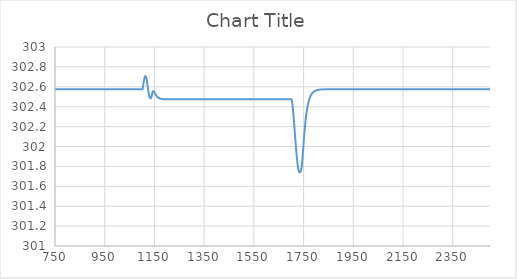
| Category | Series 0 |
|---|---|
| 1.0 | 301.715 |
| 2.0 | 301.755 |
| 3.0 | 301.821 |
| 4.0 | 301.881 |
| 5.0 | 301.937 |
| 6.0 | 301.969 |
| 7.0 | 302.009 |
| 8.0 | 302.044 |
| 9.0 | 302.079 |
| 10.0 | 302.112 |
| 11.0 | 302.143 |
| 12.0 | 302.173 |
| 13.0 | 302.2 |
| 14.0 | 302.227 |
| 15.0 | 302.251 |
| 16.0 | 302.274 |
| 17.0 | 302.296 |
| 18.0 | 302.316 |
| 19.0 | 302.335 |
| 20.0 | 302.352 |
| 21.0 | 302.369 |
| 22.0 | 302.384 |
| 23.0 | 302.398 |
| 24.0 | 302.411 |
| 25.0 | 302.423 |
| 26.0 | 302.434 |
| 27.0 | 302.445 |
| 28.0 | 302.455 |
| 29.0 | 302.464 |
| 30.0 | 302.472 |
| 31.0 | 302.48 |
| 32.0 | 302.487 |
| 33.0 | 302.493 |
| 34.0 | 302.499 |
| 35.0 | 302.505 |
| 36.0 | 302.51 |
| 37.0 | 302.515 |
| 38.0 | 302.52 |
| 39.0 | 302.524 |
| 40.0 | 302.528 |
| 41.0 | 302.531 |
| 42.0 | 302.535 |
| 43.0 | 302.538 |
| 44.0 | 302.54 |
| 45.0 | 302.543 |
| 46.0 | 302.545 |
| 47.0 | 302.548 |
| 48.0 | 302.55 |
| 49.0 | 302.552 |
| 50.0 | 302.553 |
| 51.0 | 302.555 |
| 52.0 | 302.557 |
| 53.0 | 302.558 |
| 54.0 | 302.559 |
| 55.0 | 302.56 |
| 56.0 | 302.562 |
| 57.0 | 302.563 |
| 58.0 | 302.564 |
| 59.0 | 302.564 |
| 60.0 | 302.565 |
| 61.0 | 302.566 |
| 62.0 | 302.567 |
| 63.0 | 302.567 |
| 64.0 | 302.568 |
| 65.0 | 302.568 |
| 66.0 | 302.569 |
| 67.0 | 302.569 |
| 68.0 | 302.57 |
| 69.0 | 302.57 |
| 70.0 | 302.571 |
| 71.0 | 302.571 |
| 72.0 | 302.571 |
| 73.0 | 302.572 |
| 74.0 | 302.572 |
| 75.0 | 302.572 |
| 76.0 | 302.572 |
| 77.0 | 302.573 |
| 78.0 | 302.573 |
| 79.0 | 302.573 |
| 80.0 | 302.573 |
| 81.0 | 302.573 |
| 82.0 | 302.574 |
| 83.0 | 302.574 |
| 84.0 | 302.574 |
| 85.0 | 302.574 |
| 86.0 | 302.574 |
| 87.0 | 302.574 |
| 88.0 | 302.574 |
| 89.0 | 302.574 |
| 90.0 | 302.574 |
| 91.0 | 302.574 |
| 92.0 | 302.575 |
| 93.0 | 302.575 |
| 94.0 | 302.575 |
| 95.0 | 302.575 |
| 96.0 | 302.575 |
| 97.0 | 302.575 |
| 98.0 | 302.575 |
| 99.0 | 302.575 |
| 100.0 | 302.575 |
| 101.0 | 302.575 |
| 102.0 | 302.575 |
| 103.0 | 302.575 |
| 104.0 | 302.575 |
| 105.0 | 302.575 |
| 106.0 | 302.575 |
| 107.0 | 302.575 |
| 108.0 | 302.575 |
| 109.0 | 302.575 |
| 110.0 | 302.575 |
| 111.0 | 302.575 |
| 112.0 | 302.575 |
| 113.0 | 302.575 |
| 114.0 | 302.575 |
| 115.0 | 302.575 |
| 116.0 | 302.575 |
| 117.0 | 302.575 |
| 118.0 | 302.575 |
| 119.0 | 302.575 |
| 120.0 | 302.575 |
| 121.0 | 302.575 |
| 122.0 | 302.575 |
| 123.0 | 302.575 |
| 124.0 | 302.575 |
| 125.0 | 302.575 |
| 126.0 | 302.575 |
| 127.0 | 302.575 |
| 128.0 | 302.575 |
| 129.0 | 302.575 |
| 130.0 | 302.575 |
| 131.0 | 302.575 |
| 132.0 | 302.575 |
| 133.0 | 302.575 |
| 134.0 | 302.575 |
| 135.0 | 302.575 |
| 136.0 | 302.575 |
| 137.0 | 302.575 |
| 138.0 | 302.575 |
| 139.0 | 302.575 |
| 140.0 | 302.575 |
| 141.0 | 302.575 |
| 142.0 | 302.575 |
| 143.0 | 302.575 |
| 144.0 | 302.575 |
| 145.0 | 302.575 |
| 146.0 | 302.575 |
| 147.0 | 302.575 |
| 148.0 | 302.575 |
| 149.0 | 302.575 |
| 150.0 | 302.575 |
| 151.0 | 302.575 |
| 152.0 | 302.575 |
| 153.0 | 302.575 |
| 154.0 | 302.575 |
| 155.0 | 302.575 |
| 156.0 | 302.575 |
| 157.0 | 302.575 |
| 158.0 | 302.575 |
| 159.0 | 302.575 |
| 160.0 | 302.575 |
| 161.0 | 302.575 |
| 162.0 | 302.575 |
| 163.0 | 302.575 |
| 164.0 | 302.575 |
| 165.0 | 302.575 |
| 166.0 | 302.575 |
| 167.0 | 302.575 |
| 168.0 | 302.575 |
| 169.0 | 302.575 |
| 170.0 | 302.575 |
| 171.0 | 302.575 |
| 172.0 | 302.575 |
| 173.0 | 302.575 |
| 174.0 | 302.575 |
| 175.0 | 302.575 |
| 176.0 | 302.575 |
| 177.0 | 302.575 |
| 178.0 | 302.575 |
| 179.0 | 302.575 |
| 180.0 | 302.575 |
| 181.0 | 302.575 |
| 182.0 | 302.575 |
| 183.0 | 302.575 |
| 184.0 | 302.575 |
| 185.0 | 302.575 |
| 186.0 | 302.575 |
| 187.0 | 302.575 |
| 188.0 | 302.575 |
| 189.0 | 302.575 |
| 190.0 | 302.575 |
| 191.0 | 302.575 |
| 192.0 | 302.575 |
| 193.0 | 302.575 |
| 194.0 | 302.575 |
| 195.0 | 302.575 |
| 196.0 | 302.575 |
| 197.0 | 302.575 |
| 198.0 | 302.575 |
| 199.0 | 302.575 |
| 200.0 | 302.575 |
| 201.0 | 302.575 |
| 202.0 | 302.575 |
| 203.0 | 302.575 |
| 204.0 | 302.575 |
| 205.0 | 302.575 |
| 206.0 | 302.575 |
| 207.0 | 302.575 |
| 208.0 | 302.575 |
| 209.0 | 302.575 |
| 210.0 | 302.575 |
| 211.0 | 302.575 |
| 212.0 | 302.575 |
| 213.0 | 302.575 |
| 214.0 | 302.575 |
| 215.0 | 302.575 |
| 216.0 | 302.575 |
| 217.0 | 302.575 |
| 218.0 | 302.575 |
| 219.0 | 302.575 |
| 220.0 | 302.575 |
| 221.0 | 302.575 |
| 222.0 | 302.575 |
| 223.0 | 302.575 |
| 224.0 | 302.575 |
| 225.0 | 302.575 |
| 226.0 | 302.575 |
| 227.0 | 302.575 |
| 228.0 | 302.575 |
| 229.0 | 302.575 |
| 230.0 | 302.575 |
| 231.0 | 302.575 |
| 232.0 | 302.575 |
| 233.0 | 302.575 |
| 234.0 | 302.575 |
| 235.0 | 302.575 |
| 236.0 | 302.575 |
| 237.0 | 302.575 |
| 238.0 | 302.575 |
| 239.0 | 302.575 |
| 240.0 | 302.575 |
| 241.0 | 302.575 |
| 242.0 | 302.575 |
| 243.0 | 302.575 |
| 244.0 | 302.575 |
| 245.0 | 302.575 |
| 246.0 | 302.575 |
| 247.0 | 302.575 |
| 248.0 | 302.575 |
| 249.0 | 302.575 |
| 250.0 | 302.575 |
| 251.0 | 302.575 |
| 252.0 | 302.575 |
| 253.0 | 302.575 |
| 254.0 | 302.575 |
| 255.0 | 302.575 |
| 256.0 | 302.575 |
| 257.0 | 302.575 |
| 258.0 | 302.575 |
| 259.0 | 302.575 |
| 260.0 | 302.575 |
| 261.0 | 302.575 |
| 262.0 | 302.575 |
| 263.0 | 302.575 |
| 264.0 | 302.575 |
| 265.0 | 302.575 |
| 266.0 | 302.575 |
| 267.0 | 302.575 |
| 268.0 | 302.575 |
| 269.0 | 302.575 |
| 270.0 | 302.575 |
| 271.0 | 302.575 |
| 272.0 | 302.575 |
| 273.0 | 302.575 |
| 274.0 | 302.575 |
| 275.0 | 302.575 |
| 276.0 | 302.575 |
| 277.0 | 302.575 |
| 278.0 | 302.575 |
| 279.0 | 302.575 |
| 280.0 | 302.575 |
| 281.0 | 302.575 |
| 282.0 | 302.575 |
| 283.0 | 302.575 |
| 284.0 | 302.575 |
| 285.0 | 302.575 |
| 286.0 | 302.575 |
| 287.0 | 302.575 |
| 288.0 | 302.575 |
| 289.0 | 302.575 |
| 290.0 | 302.575 |
| 291.0 | 302.575 |
| 292.0 | 302.575 |
| 293.0 | 302.575 |
| 294.0 | 302.575 |
| 295.0 | 302.575 |
| 296.0 | 302.575 |
| 297.0 | 302.575 |
| 298.0 | 302.575 |
| 299.0 | 302.575 |
| 300.0 | 302.575 |
| 301.0 | 302.575 |
| 302.0 | 302.575 |
| 303.0 | 302.575 |
| 304.0 | 302.575 |
| 305.0 | 302.575 |
| 306.0 | 302.575 |
| 307.0 | 302.575 |
| 308.0 | 302.575 |
| 309.0 | 302.575 |
| 310.0 | 302.575 |
| 311.0 | 302.575 |
| 312.0 | 302.575 |
| 313.0 | 302.575 |
| 314.0 | 302.575 |
| 315.0 | 302.575 |
| 316.0 | 302.575 |
| 317.0 | 302.575 |
| 318.0 | 302.575 |
| 319.0 | 302.575 |
| 320.0 | 302.575 |
| 321.0 | 302.575 |
| 322.0 | 302.575 |
| 323.0 | 302.575 |
| 324.0 | 302.575 |
| 325.0 | 302.575 |
| 326.0 | 302.575 |
| 327.0 | 302.575 |
| 328.0 | 302.575 |
| 329.0 | 302.575 |
| 330.0 | 302.575 |
| 331.0 | 302.575 |
| 332.0 | 302.575 |
| 333.0 | 302.575 |
| 334.0 | 302.575 |
| 335.0 | 302.575 |
| 336.0 | 302.575 |
| 337.0 | 302.575 |
| 338.0 | 302.575 |
| 339.0 | 302.575 |
| 340.0 | 302.575 |
| 341.0 | 302.575 |
| 342.0 | 302.575 |
| 343.0 | 302.575 |
| 344.0 | 302.575 |
| 345.0 | 302.575 |
| 346.0 | 302.575 |
| 347.0 | 302.575 |
| 348.0 | 302.575 |
| 349.0 | 302.575 |
| 350.0 | 302.575 |
| 351.0 | 302.575 |
| 352.0 | 302.575 |
| 353.0 | 302.575 |
| 354.0 | 302.575 |
| 355.0 | 302.575 |
| 356.0 | 302.575 |
| 357.0 | 302.575 |
| 358.0 | 302.575 |
| 359.0 | 302.575 |
| 360.0 | 302.575 |
| 361.0 | 302.575 |
| 362.0 | 302.575 |
| 363.0 | 302.575 |
| 364.0 | 302.575 |
| 365.0 | 302.575 |
| 366.0 | 302.575 |
| 367.0 | 302.575 |
| 368.0 | 302.575 |
| 369.0 | 302.575 |
| 370.0 | 302.575 |
| 371.0 | 302.575 |
| 372.0 | 302.575 |
| 373.0 | 302.575 |
| 374.0 | 302.575 |
| 375.0 | 302.575 |
| 376.0 | 302.575 |
| 377.0 | 302.575 |
| 378.0 | 302.575 |
| 379.0 | 302.575 |
| 380.0 | 302.575 |
| 381.0 | 302.575 |
| 382.0 | 302.575 |
| 383.0 | 302.575 |
| 384.0 | 302.575 |
| 385.0 | 302.575 |
| 386.0 | 302.575 |
| 387.0 | 302.575 |
| 388.0 | 302.575 |
| 389.0 | 302.575 |
| 390.0 | 302.575 |
| 391.0 | 302.575 |
| 392.0 | 302.575 |
| 393.0 | 302.575 |
| 394.0 | 302.575 |
| 395.0 | 302.575 |
| 396.0 | 302.575 |
| 397.0 | 302.575 |
| 398.0 | 302.575 |
| 399.0 | 302.575 |
| 400.0 | 302.575 |
| 401.0 | 302.575 |
| 402.0 | 302.575 |
| 403.0 | 302.575 |
| 404.0 | 302.575 |
| 405.0 | 302.575 |
| 406.0 | 302.575 |
| 407.0 | 302.575 |
| 408.0 | 302.575 |
| 409.0 | 302.575 |
| 410.0 | 302.575 |
| 411.0 | 302.575 |
| 412.0 | 302.575 |
| 413.0 | 302.575 |
| 414.0 | 302.575 |
| 415.0 | 302.575 |
| 416.0 | 302.575 |
| 417.0 | 302.575 |
| 418.0 | 302.575 |
| 419.0 | 302.575 |
| 420.0 | 302.575 |
| 421.0 | 302.575 |
| 422.0 | 302.575 |
| 423.0 | 302.575 |
| 424.0 | 302.575 |
| 425.0 | 302.575 |
| 426.0 | 302.575 |
| 427.0 | 302.575 |
| 428.0 | 302.575 |
| 429.0 | 302.575 |
| 430.0 | 302.575 |
| 431.0 | 302.575 |
| 432.0 | 302.575 |
| 433.0 | 302.575 |
| 434.0 | 302.575 |
| 435.0 | 302.575 |
| 436.0 | 302.575 |
| 437.0 | 302.575 |
| 438.0 | 302.575 |
| 439.0 | 302.575 |
| 440.0 | 302.575 |
| 441.0 | 302.575 |
| 442.0 | 302.575 |
| 443.0 | 302.575 |
| 444.0 | 302.575 |
| 445.0 | 302.575 |
| 446.0 | 302.575 |
| 447.0 | 302.575 |
| 448.0 | 302.575 |
| 449.0 | 302.575 |
| 450.0 | 302.575 |
| 451.0 | 302.575 |
| 452.0 | 302.575 |
| 453.0 | 302.575 |
| 454.0 | 302.575 |
| 455.0 | 302.575 |
| 456.0 | 302.575 |
| 457.0 | 302.575 |
| 458.0 | 302.575 |
| 459.0 | 302.575 |
| 460.0 | 302.575 |
| 461.0 | 302.575 |
| 462.0 | 302.575 |
| 463.0 | 302.575 |
| 464.0 | 302.575 |
| 465.0 | 302.575 |
| 466.0 | 302.575 |
| 467.0 | 302.575 |
| 468.0 | 302.575 |
| 469.0 | 302.575 |
| 470.0 | 302.575 |
| 471.0 | 302.575 |
| 472.0 | 302.575 |
| 473.0 | 302.575 |
| 474.0 | 302.575 |
| 475.0 | 302.575 |
| 476.0 | 302.575 |
| 477.0 | 302.575 |
| 478.0 | 302.575 |
| 479.0 | 302.575 |
| 480.0 | 302.575 |
| 481.0 | 302.575 |
| 482.0 | 302.575 |
| 483.0 | 302.575 |
| 484.0 | 302.575 |
| 485.0 | 302.575 |
| 486.0 | 302.575 |
| 487.0 | 302.575 |
| 488.0 | 302.575 |
| 489.0 | 302.575 |
| 490.0 | 302.575 |
| 491.0 | 302.575 |
| 492.0 | 302.575 |
| 493.0 | 302.575 |
| 494.0 | 302.575 |
| 495.0 | 302.575 |
| 496.0 | 302.575 |
| 497.0 | 302.575 |
| 498.0 | 302.575 |
| 499.0 | 302.575 |
| 500.0 | 302.575 |
| 501.0 | 302.575 |
| 502.0 | 302.575 |
| 503.0 | 302.575 |
| 504.0 | 302.575 |
| 505.0 | 302.575 |
| 506.0 | 302.575 |
| 507.0 | 302.575 |
| 508.0 | 302.575 |
| 509.0 | 302.575 |
| 510.0 | 302.575 |
| 511.0 | 302.575 |
| 512.0 | 302.575 |
| 513.0 | 302.575 |
| 514.0 | 302.575 |
| 515.0 | 302.575 |
| 516.0 | 302.575 |
| 517.0 | 302.575 |
| 518.0 | 302.575 |
| 519.0 | 302.575 |
| 520.0 | 302.575 |
| 521.0 | 302.575 |
| 522.0 | 302.575 |
| 523.0 | 302.575 |
| 524.0 | 302.575 |
| 525.0 | 302.575 |
| 526.0 | 302.575 |
| 527.0 | 302.575 |
| 528.0 | 302.575 |
| 529.0 | 302.575 |
| 530.0 | 302.575 |
| 531.0 | 302.575 |
| 532.0 | 302.575 |
| 533.0 | 302.575 |
| 534.0 | 302.575 |
| 535.0 | 302.575 |
| 536.0 | 302.575 |
| 537.0 | 302.575 |
| 538.0 | 302.575 |
| 539.0 | 302.575 |
| 540.0 | 302.575 |
| 541.0 | 302.575 |
| 542.0 | 302.575 |
| 543.0 | 302.575 |
| 544.0 | 302.575 |
| 545.0 | 302.575 |
| 546.0 | 302.575 |
| 547.0 | 302.575 |
| 548.0 | 302.575 |
| 549.0 | 302.575 |
| 550.0 | 302.575 |
| 551.0 | 302.575 |
| 552.0 | 302.575 |
| 553.0 | 302.575 |
| 554.0 | 302.575 |
| 555.0 | 302.575 |
| 556.0 | 302.575 |
| 557.0 | 302.575 |
| 558.0 | 302.575 |
| 559.0 | 302.575 |
| 560.0 | 302.575 |
| 561.0 | 302.575 |
| 562.0 | 302.575 |
| 563.0 | 302.575 |
| 564.0 | 302.575 |
| 565.0 | 302.575 |
| 566.0 | 302.575 |
| 567.0 | 302.575 |
| 568.0 | 302.575 |
| 569.0 | 302.575 |
| 570.0 | 302.575 |
| 571.0 | 302.575 |
| 572.0 | 302.575 |
| 573.0 | 302.575 |
| 574.0 | 302.575 |
| 575.0 | 302.575 |
| 576.0 | 302.575 |
| 577.0 | 302.575 |
| 578.0 | 302.575 |
| 579.0 | 302.575 |
| 580.0 | 302.575 |
| 581.0 | 302.575 |
| 582.0 | 302.575 |
| 583.0 | 302.575 |
| 584.0 | 302.575 |
| 585.0 | 302.575 |
| 586.0 | 302.575 |
| 587.0 | 302.575 |
| 588.0 | 302.575 |
| 589.0 | 302.575 |
| 590.0 | 302.575 |
| 591.0 | 302.575 |
| 592.0 | 302.575 |
| 593.0 | 302.575 |
| 594.0 | 302.575 |
| 595.0 | 302.575 |
| 596.0 | 302.575 |
| 597.0 | 302.575 |
| 598.0 | 302.575 |
| 599.0 | 302.575 |
| 600.0 | 302.575 |
| 601.0 | 302.575 |
| 602.0 | 302.575 |
| 603.0 | 302.575 |
| 604.0 | 302.575 |
| 605.0 | 302.575 |
| 606.0 | 302.575 |
| 607.0 | 302.575 |
| 608.0 | 302.575 |
| 609.0 | 302.575 |
| 610.0 | 302.575 |
| 611.0 | 302.575 |
| 612.0 | 302.575 |
| 613.0 | 302.575 |
| 614.0 | 302.575 |
| 615.0 | 302.575 |
| 616.0 | 302.575 |
| 617.0 | 302.575 |
| 618.0 | 302.575 |
| 619.0 | 302.575 |
| 620.0 | 302.575 |
| 621.0 | 302.575 |
| 622.0 | 302.575 |
| 623.0 | 302.575 |
| 624.0 | 302.575 |
| 625.0 | 302.575 |
| 626.0 | 302.575 |
| 627.0 | 302.575 |
| 628.0 | 302.575 |
| 629.0 | 302.575 |
| 630.0 | 302.575 |
| 631.0 | 302.575 |
| 632.0 | 302.575 |
| 633.0 | 302.575 |
| 634.0 | 302.575 |
| 635.0 | 302.575 |
| 636.0 | 302.575 |
| 637.0 | 302.575 |
| 638.0 | 302.575 |
| 639.0 | 302.575 |
| 640.0 | 302.575 |
| 641.0 | 302.575 |
| 642.0 | 302.575 |
| 643.0 | 302.575 |
| 644.0 | 302.575 |
| 645.0 | 302.575 |
| 646.0 | 302.575 |
| 647.0 | 302.575 |
| 648.0 | 302.575 |
| 649.0 | 302.575 |
| 650.0 | 302.575 |
| 651.0 | 302.575 |
| 652.0 | 302.575 |
| 653.0 | 302.575 |
| 654.0 | 302.575 |
| 655.0 | 302.575 |
| 656.0 | 302.575 |
| 657.0 | 302.575 |
| 658.0 | 302.575 |
| 659.0 | 302.575 |
| 660.0 | 302.575 |
| 661.0 | 302.575 |
| 662.0 | 302.575 |
| 663.0 | 302.575 |
| 664.0 | 302.575 |
| 665.0 | 302.575 |
| 666.0 | 302.575 |
| 667.0 | 302.575 |
| 668.0 | 302.575 |
| 669.0 | 302.575 |
| 670.0 | 302.575 |
| 671.0 | 302.575 |
| 672.0 | 302.575 |
| 673.0 | 302.575 |
| 674.0 | 302.575 |
| 675.0 | 302.575 |
| 676.0 | 302.575 |
| 677.0 | 302.575 |
| 678.0 | 302.575 |
| 679.0 | 302.575 |
| 680.0 | 302.575 |
| 681.0 | 302.575 |
| 682.0 | 302.575 |
| 683.0 | 302.575 |
| 684.0 | 302.575 |
| 685.0 | 302.575 |
| 686.0 | 302.575 |
| 687.0 | 302.575 |
| 688.0 | 302.575 |
| 689.0 | 302.575 |
| 690.0 | 302.575 |
| 691.0 | 302.575 |
| 692.0 | 302.575 |
| 693.0 | 302.575 |
| 694.0 | 302.575 |
| 695.0 | 302.575 |
| 696.0 | 302.575 |
| 697.0 | 302.575 |
| 698.0 | 302.575 |
| 699.0 | 302.575 |
| 700.0 | 302.575 |
| 701.0 | 302.575 |
| 702.0 | 302.575 |
| 703.0 | 302.575 |
| 704.0 | 302.575 |
| 705.0 | 302.575 |
| 706.0 | 302.575 |
| 707.0 | 302.575 |
| 708.0 | 302.575 |
| 709.0 | 302.575 |
| 710.0 | 302.575 |
| 711.0 | 302.575 |
| 712.0 | 302.575 |
| 713.0 | 302.575 |
| 714.0 | 302.575 |
| 715.0 | 302.575 |
| 716.0 | 302.575 |
| 717.0 | 302.575 |
| 718.0 | 302.575 |
| 719.0 | 302.575 |
| 720.0 | 302.575 |
| 721.0 | 302.575 |
| 722.0 | 302.575 |
| 723.0 | 302.575 |
| 724.0 | 302.575 |
| 725.0 | 302.575 |
| 726.0 | 302.575 |
| 727.0 | 302.575 |
| 728.0 | 302.575 |
| 729.0 | 302.575 |
| 730.0 | 302.575 |
| 731.0 | 302.575 |
| 732.0 | 302.575 |
| 733.0 | 302.575 |
| 734.0 | 302.575 |
| 735.0 | 302.575 |
| 736.0 | 302.575 |
| 737.0 | 302.575 |
| 738.0 | 302.575 |
| 739.0 | 302.575 |
| 740.0 | 302.575 |
| 741.0 | 302.575 |
| 742.0 | 302.575 |
| 743.0 | 302.575 |
| 744.0 | 302.575 |
| 745.0 | 302.575 |
| 746.0 | 302.575 |
| 747.0 | 302.575 |
| 748.0 | 302.575 |
| 749.0 | 302.575 |
| 750.0 | 302.575 |
| 751.0 | 302.575 |
| 752.0 | 302.575 |
| 753.0 | 302.575 |
| 754.0 | 302.575 |
| 755.0 | 302.575 |
| 756.0 | 302.575 |
| 757.0 | 302.575 |
| 758.0 | 302.575 |
| 759.0 | 302.575 |
| 760.0 | 302.575 |
| 761.0 | 302.575 |
| 762.0 | 302.575 |
| 763.0 | 302.575 |
| 764.0 | 302.575 |
| 765.0 | 302.575 |
| 766.0 | 302.575 |
| 767.0 | 302.575 |
| 768.0 | 302.575 |
| 769.0 | 302.575 |
| 770.0 | 302.575 |
| 771.0 | 302.575 |
| 772.0 | 302.575 |
| 773.0 | 302.575 |
| 774.0 | 302.575 |
| 775.0 | 302.575 |
| 776.0 | 302.575 |
| 777.0 | 302.575 |
| 778.0 | 302.575 |
| 779.0 | 302.575 |
| 780.0 | 302.575 |
| 781.0 | 302.575 |
| 782.0 | 302.575 |
| 783.0 | 302.575 |
| 784.0 | 302.575 |
| 785.0 | 302.575 |
| 786.0 | 302.575 |
| 787.0 | 302.575 |
| 788.0 | 302.575 |
| 789.0 | 302.575 |
| 790.0 | 302.575 |
| 791.0 | 302.575 |
| 792.0 | 302.575 |
| 793.0 | 302.575 |
| 794.0 | 302.575 |
| 795.0 | 302.575 |
| 796.0 | 302.575 |
| 797.0 | 302.575 |
| 798.0 | 302.575 |
| 799.0 | 302.575 |
| 800.0 | 302.575 |
| 801.0 | 302.575 |
| 802.0 | 302.575 |
| 803.0 | 302.575 |
| 804.0 | 302.575 |
| 805.0 | 302.575 |
| 806.0 | 302.575 |
| 807.0 | 302.575 |
| 808.0 | 302.575 |
| 809.0 | 302.575 |
| 810.0 | 302.575 |
| 811.0 | 302.575 |
| 812.0 | 302.575 |
| 813.0 | 302.575 |
| 814.0 | 302.575 |
| 815.0 | 302.575 |
| 816.0 | 302.575 |
| 817.0 | 302.575 |
| 818.0 | 302.575 |
| 819.0 | 302.575 |
| 820.0 | 302.575 |
| 821.0 | 302.575 |
| 822.0 | 302.575 |
| 823.0 | 302.575 |
| 824.0 | 302.575 |
| 825.0 | 302.575 |
| 826.0 | 302.575 |
| 827.0 | 302.575 |
| 828.0 | 302.575 |
| 829.0 | 302.575 |
| 830.0 | 302.575 |
| 831.0 | 302.575 |
| 832.0 | 302.575 |
| 833.0 | 302.575 |
| 834.0 | 302.575 |
| 835.0 | 302.575 |
| 836.0 | 302.575 |
| 837.0 | 302.575 |
| 838.0 | 302.575 |
| 839.0 | 302.575 |
| 840.0 | 302.575 |
| 841.0 | 302.575 |
| 842.0 | 302.575 |
| 843.0 | 302.575 |
| 844.0 | 302.575 |
| 845.0 | 302.575 |
| 846.0 | 302.575 |
| 847.0 | 302.575 |
| 848.0 | 302.575 |
| 849.0 | 302.575 |
| 850.0 | 302.575 |
| 851.0 | 302.575 |
| 852.0 | 302.575 |
| 853.0 | 302.575 |
| 854.0 | 302.575 |
| 855.0 | 302.575 |
| 856.0 | 302.575 |
| 857.0 | 302.575 |
| 858.0 | 302.575 |
| 859.0 | 302.575 |
| 860.0 | 302.575 |
| 861.0 | 302.575 |
| 862.0 | 302.575 |
| 863.0 | 302.575 |
| 864.0 | 302.575 |
| 865.0 | 302.575 |
| 866.0 | 302.575 |
| 867.0 | 302.575 |
| 868.0 | 302.575 |
| 869.0 | 302.575 |
| 870.0 | 302.575 |
| 871.0 | 302.575 |
| 872.0 | 302.575 |
| 873.0 | 302.575 |
| 874.0 | 302.575 |
| 875.0 | 302.575 |
| 876.0 | 302.575 |
| 877.0 | 302.575 |
| 878.0 | 302.575 |
| 879.0 | 302.575 |
| 880.0 | 302.575 |
| 881.0 | 302.575 |
| 882.0 | 302.575 |
| 883.0 | 302.575 |
| 884.0 | 302.575 |
| 885.0 | 302.575 |
| 886.0 | 302.575 |
| 887.0 | 302.575 |
| 888.0 | 302.575 |
| 889.0 | 302.575 |
| 890.0 | 302.575 |
| 891.0 | 302.575 |
| 892.0 | 302.575 |
| 893.0 | 302.575 |
| 894.0 | 302.575 |
| 895.0 | 302.575 |
| 896.0 | 302.575 |
| 897.0 | 302.575 |
| 898.0 | 302.575 |
| 899.0 | 302.575 |
| 900.0 | 302.575 |
| 901.0 | 302.575 |
| 902.0 | 302.575 |
| 903.0 | 302.575 |
| 904.0 | 302.575 |
| 905.0 | 302.575 |
| 906.0 | 302.575 |
| 907.0 | 302.575 |
| 908.0 | 302.575 |
| 909.0 | 302.575 |
| 910.0 | 302.575 |
| 911.0 | 302.575 |
| 912.0 | 302.575 |
| 913.0 | 302.575 |
| 914.0 | 302.575 |
| 915.0 | 302.575 |
| 916.0 | 302.575 |
| 917.0 | 302.575 |
| 918.0 | 302.575 |
| 919.0 | 302.575 |
| 920.0 | 302.575 |
| 921.0 | 302.575 |
| 922.0 | 302.575 |
| 923.0 | 302.575 |
| 924.0 | 302.575 |
| 925.0 | 302.575 |
| 926.0 | 302.575 |
| 927.0 | 302.575 |
| 928.0 | 302.575 |
| 929.0 | 302.575 |
| 930.0 | 302.575 |
| 931.0 | 302.575 |
| 932.0 | 302.575 |
| 933.0 | 302.575 |
| 934.0 | 302.575 |
| 935.0 | 302.575 |
| 936.0 | 302.575 |
| 937.0 | 302.575 |
| 938.0 | 302.575 |
| 939.0 | 302.575 |
| 940.0 | 302.575 |
| 941.0 | 302.575 |
| 942.0 | 302.575 |
| 943.0 | 302.575 |
| 944.0 | 302.575 |
| 945.0 | 302.575 |
| 946.0 | 302.575 |
| 947.0 | 302.575 |
| 948.0 | 302.575 |
| 949.0 | 302.575 |
| 950.0 | 302.575 |
| 951.0 | 302.575 |
| 952.0 | 302.575 |
| 953.0 | 302.575 |
| 954.0 | 302.575 |
| 955.0 | 302.575 |
| 956.0 | 302.575 |
| 957.0 | 302.575 |
| 958.0 | 302.575 |
| 959.0 | 302.575 |
| 960.0 | 302.575 |
| 961.0 | 302.575 |
| 962.0 | 302.575 |
| 963.0 | 302.575 |
| 964.0 | 302.575 |
| 965.0 | 302.575 |
| 966.0 | 302.575 |
| 967.0 | 302.575 |
| 968.0 | 302.575 |
| 969.0 | 302.575 |
| 970.0 | 302.575 |
| 971.0 | 302.575 |
| 972.0 | 302.575 |
| 973.0 | 302.575 |
| 974.0 | 302.575 |
| 975.0 | 302.575 |
| 976.0 | 302.575 |
| 977.0 | 302.575 |
| 978.0 | 302.575 |
| 979.0 | 302.575 |
| 980.0 | 302.575 |
| 981.0 | 302.575 |
| 982.0 | 302.575 |
| 983.0 | 302.575 |
| 984.0 | 302.575 |
| 985.0 | 302.575 |
| 986.0 | 302.575 |
| 987.0 | 302.575 |
| 988.0 | 302.575 |
| 989.0 | 302.575 |
| 990.0 | 302.575 |
| 991.0 | 302.575 |
| 992.0 | 302.575 |
| 993.0 | 302.575 |
| 994.0 | 302.575 |
| 995.0 | 302.575 |
| 996.0 | 302.575 |
| 997.0 | 302.575 |
| 998.0 | 302.575 |
| 999.0 | 302.575 |
| 1000.0 | 302.575 |
| 1001.0 | 302.575 |
| 1002.0 | 302.575 |
| 1003.0 | 302.575 |
| 1004.0 | 302.575 |
| 1005.0 | 302.575 |
| 1006.0 | 302.575 |
| 1007.0 | 302.575 |
| 1008.0 | 302.575 |
| 1009.0 | 302.575 |
| 1010.0 | 302.575 |
| 1011.0 | 302.575 |
| 1012.0 | 302.575 |
| 1013.0 | 302.575 |
| 1014.0 | 302.575 |
| 1015.0 | 302.575 |
| 1016.0 | 302.575 |
| 1017.0 | 302.575 |
| 1018.0 | 302.575 |
| 1019.0 | 302.575 |
| 1020.0 | 302.575 |
| 1021.0 | 302.575 |
| 1022.0 | 302.575 |
| 1023.0 | 302.575 |
| 1024.0 | 302.575 |
| 1025.0 | 302.575 |
| 1026.0 | 302.575 |
| 1027.0 | 302.575 |
| 1028.0 | 302.575 |
| 1029.0 | 302.575 |
| 1030.0 | 302.575 |
| 1031.0 | 302.575 |
| 1032.0 | 302.575 |
| 1033.0 | 302.575 |
| 1034.0 | 302.575 |
| 1035.0 | 302.575 |
| 1036.0 | 302.575 |
| 1037.0 | 302.575 |
| 1038.0 | 302.575 |
| 1039.0 | 302.575 |
| 1040.0 | 302.575 |
| 1041.0 | 302.575 |
| 1042.0 | 302.575 |
| 1043.0 | 302.575 |
| 1044.0 | 302.575 |
| 1045.0 | 302.575 |
| 1046.0 | 302.575 |
| 1047.0 | 302.575 |
| 1048.0 | 302.575 |
| 1049.0 | 302.575 |
| 1050.0 | 302.575 |
| 1051.0 | 302.575 |
| 1052.0 | 302.575 |
| 1053.0 | 302.575 |
| 1054.0 | 302.575 |
| 1055.0 | 302.575 |
| 1056.0 | 302.575 |
| 1057.0 | 302.575 |
| 1058.0 | 302.575 |
| 1059.0 | 302.575 |
| 1060.0 | 302.575 |
| 1061.0 | 302.575 |
| 1062.0 | 302.575 |
| 1063.0 | 302.575 |
| 1064.0 | 302.575 |
| 1065.0 | 302.575 |
| 1066.0 | 302.575 |
| 1067.0 | 302.575 |
| 1068.0 | 302.575 |
| 1069.0 | 302.575 |
| 1070.0 | 302.575 |
| 1071.0 | 302.575 |
| 1072.0 | 302.575 |
| 1073.0 | 302.575 |
| 1074.0 | 302.575 |
| 1075.0 | 302.575 |
| 1076.0 | 302.575 |
| 1077.0 | 302.575 |
| 1078.0 | 302.575 |
| 1079.0 | 302.575 |
| 1080.0 | 302.575 |
| 1081.0 | 302.575 |
| 1082.0 | 302.575 |
| 1083.0 | 302.575 |
| 1084.0 | 302.575 |
| 1085.0 | 302.575 |
| 1086.0 | 302.575 |
| 1087.0 | 302.575 |
| 1088.0 | 302.575 |
| 1089.0 | 302.575 |
| 1090.0 | 302.575 |
| 1091.0 | 302.575 |
| 1092.0 | 302.575 |
| 1093.0 | 302.575 |
| 1094.0 | 302.575 |
| 1095.0 | 302.575 |
| 1096.0 | 302.575 |
| 1097.0 | 302.575 |
| 1098.0 | 302.575 |
| 1099.0 | 302.575 |
| 1100.0 | 302.575 |
| 1101.0 | 302.576 |
| 1102.0 | 302.576 |
| 1103.0 | 302.588 |
| 1104.0 | 302.601 |
| 1105.0 | 302.617 |
| 1106.0 | 302.633 |
| 1107.0 | 302.649 |
| 1108.0 | 302.664 |
| 1109.0 | 302.678 |
| 1110.0 | 302.689 |
| 1111.0 | 302.698 |
| 1112.0 | 302.704 |
| 1113.0 | 302.707 |
| 1114.0 | 302.707 |
| 1115.0 | 302.704 |
| 1116.0 | 302.699 |
| 1117.0 | 302.691 |
| 1118.0 | 302.681 |
| 1119.0 | 302.668 |
| 1120.0 | 302.653 |
| 1121.0 | 302.636 |
| 1122.0 | 302.619 |
| 1123.0 | 302.601 |
| 1124.0 | 302.583 |
| 1125.0 | 302.566 |
| 1126.0 | 302.55 |
| 1127.0 | 302.536 |
| 1128.0 | 302.523 |
| 1129.0 | 302.511 |
| 1130.0 | 302.502 |
| 1131.0 | 302.494 |
| 1132.0 | 302.489 |
| 1133.0 | 302.485 |
| 1134.0 | 302.484 |
| 1135.0 | 302.485 |
| 1136.0 | 302.487 |
| 1137.0 | 302.492 |
| 1138.0 | 302.499 |
| 1139.0 | 302.508 |
| 1140.0 | 302.519 |
| 1141.0 | 302.53 |
| 1142.0 | 302.546 |
| 1143.0 | 302.55 |
| 1144.0 | 302.554 |
| 1145.0 | 302.555 |
| 1146.0 | 302.555 |
| 1147.0 | 302.553 |
| 1148.0 | 302.55 |
| 1149.0 | 302.547 |
| 1150.0 | 302.543 |
| 1151.0 | 302.538 |
| 1152.0 | 302.534 |
| 1153.0 | 302.53 |
| 1154.0 | 302.525 |
| 1155.0 | 302.521 |
| 1156.0 | 302.517 |
| 1157.0 | 302.513 |
| 1158.0 | 302.51 |
| 1159.0 | 302.506 |
| 1160.0 | 302.503 |
| 1161.0 | 302.501 |
| 1162.0 | 302.498 |
| 1163.0 | 302.496 |
| 1164.0 | 302.493 |
| 1165.0 | 302.491 |
| 1166.0 | 302.49 |
| 1167.0 | 302.488 |
| 1168.0 | 302.487 |
| 1169.0 | 302.485 |
| 1170.0 | 302.484 |
| 1171.0 | 302.483 |
| 1172.0 | 302.482 |
| 1173.0 | 302.481 |
| 1174.0 | 302.48 |
| 1175.0 | 302.48 |
| 1176.0 | 302.479 |
| 1177.0 | 302.479 |
| 1178.0 | 302.478 |
| 1179.0 | 302.478 |
| 1180.0 | 302.477 |
| 1181.0 | 302.477 |
| 1182.0 | 302.477 |
| 1183.0 | 302.476 |
| 1184.0 | 302.476 |
| 1185.0 | 302.476 |
| 1186.0 | 302.476 |
| 1187.0 | 302.476 |
| 1188.0 | 302.475 |
| 1189.0 | 302.475 |
| 1190.0 | 302.475 |
| 1191.0 | 302.475 |
| 1192.0 | 302.475 |
| 1193.0 | 302.475 |
| 1194.0 | 302.475 |
| 1195.0 | 302.475 |
| 1196.0 | 302.475 |
| 1197.0 | 302.475 |
| 1198.0 | 302.475 |
| 1199.0 | 302.475 |
| 1200.0 | 302.475 |
| 1201.0 | 302.474 |
| 1202.0 | 302.474 |
| 1203.0 | 302.474 |
| 1204.0 | 302.474 |
| 1205.0 | 302.474 |
| 1206.0 | 302.474 |
| 1207.0 | 302.474 |
| 1208.0 | 302.474 |
| 1209.0 | 302.474 |
| 1210.0 | 302.474 |
| 1211.0 | 302.474 |
| 1212.0 | 302.474 |
| 1213.0 | 302.474 |
| 1214.0 | 302.474 |
| 1215.0 | 302.474 |
| 1216.0 | 302.474 |
| 1217.0 | 302.474 |
| 1218.0 | 302.474 |
| 1219.0 | 302.474 |
| 1220.0 | 302.474 |
| 1221.0 | 302.474 |
| 1222.0 | 302.474 |
| 1223.0 | 302.474 |
| 1224.0 | 302.474 |
| 1225.0 | 302.474 |
| 1226.0 | 302.474 |
| 1227.0 | 302.474 |
| 1228.0 | 302.474 |
| 1229.0 | 302.474 |
| 1230.0 | 302.474 |
| 1231.0 | 302.474 |
| 1232.0 | 302.474 |
| 1233.0 | 302.474 |
| 1234.0 | 302.474 |
| 1235.0 | 302.474 |
| 1236.0 | 302.474 |
| 1237.0 | 302.474 |
| 1238.0 | 302.474 |
| 1239.0 | 302.474 |
| 1240.0 | 302.474 |
| 1241.0 | 302.474 |
| 1242.0 | 302.474 |
| 1243.0 | 302.474 |
| 1244.0 | 302.474 |
| 1245.0 | 302.474 |
| 1246.0 | 302.474 |
| 1247.0 | 302.474 |
| 1248.0 | 302.474 |
| 1249.0 | 302.474 |
| 1250.0 | 302.474 |
| 1251.0 | 302.474 |
| 1252.0 | 302.474 |
| 1253.0 | 302.474 |
| 1254.0 | 302.474 |
| 1255.0 | 302.474 |
| 1256.0 | 302.474 |
| 1257.0 | 302.474 |
| 1258.0 | 302.474 |
| 1259.0 | 302.474 |
| 1260.0 | 302.474 |
| 1261.0 | 302.474 |
| 1262.0 | 302.474 |
| 1263.0 | 302.474 |
| 1264.0 | 302.474 |
| 1265.0 | 302.474 |
| 1266.0 | 302.474 |
| 1267.0 | 302.474 |
| 1268.0 | 302.474 |
| 1269.0 | 302.474 |
| 1270.0 | 302.474 |
| 1271.0 | 302.474 |
| 1272.0 | 302.474 |
| 1273.0 | 302.474 |
| 1274.0 | 302.474 |
| 1275.0 | 302.474 |
| 1276.0 | 302.474 |
| 1277.0 | 302.474 |
| 1278.0 | 302.474 |
| 1279.0 | 302.474 |
| 1280.0 | 302.474 |
| 1281.0 | 302.474 |
| 1282.0 | 302.474 |
| 1283.0 | 302.474 |
| 1284.0 | 302.474 |
| 1285.0 | 302.474 |
| 1286.0 | 302.474 |
| 1287.0 | 302.474 |
| 1288.0 | 302.474 |
| 1289.0 | 302.474 |
| 1290.0 | 302.474 |
| 1291.0 | 302.474 |
| 1292.0 | 302.474 |
| 1293.0 | 302.474 |
| 1294.0 | 302.474 |
| 1295.0 | 302.474 |
| 1296.0 | 302.474 |
| 1297.0 | 302.474 |
| 1298.0 | 302.474 |
| 1299.0 | 302.474 |
| 1300.0 | 302.474 |
| 1301.0 | 302.474 |
| 1302.0 | 302.474 |
| 1303.0 | 302.474 |
| 1304.0 | 302.474 |
| 1305.0 | 302.474 |
| 1306.0 | 302.474 |
| 1307.0 | 302.474 |
| 1308.0 | 302.474 |
| 1309.0 | 302.474 |
| 1310.0 | 302.474 |
| 1311.0 | 302.474 |
| 1312.0 | 302.474 |
| 1313.0 | 302.474 |
| 1314.0 | 302.474 |
| 1315.0 | 302.474 |
| 1316.0 | 302.474 |
| 1317.0 | 302.474 |
| 1318.0 | 302.474 |
| 1319.0 | 302.474 |
| 1320.0 | 302.474 |
| 1321.0 | 302.474 |
| 1322.0 | 302.474 |
| 1323.0 | 302.474 |
| 1324.0 | 302.474 |
| 1325.0 | 302.474 |
| 1326.0 | 302.474 |
| 1327.0 | 302.474 |
| 1328.0 | 302.474 |
| 1329.0 | 302.474 |
| 1330.0 | 302.474 |
| 1331.0 | 302.474 |
| 1332.0 | 302.474 |
| 1333.0 | 302.474 |
| 1334.0 | 302.474 |
| 1335.0 | 302.474 |
| 1336.0 | 302.474 |
| 1337.0 | 302.474 |
| 1338.0 | 302.474 |
| 1339.0 | 302.474 |
| 1340.0 | 302.474 |
| 1341.0 | 302.474 |
| 1342.0 | 302.474 |
| 1343.0 | 302.474 |
| 1344.0 | 302.474 |
| 1345.0 | 302.474 |
| 1346.0 | 302.474 |
| 1347.0 | 302.474 |
| 1348.0 | 302.474 |
| 1349.0 | 302.474 |
| 1350.0 | 302.474 |
| 1351.0 | 302.474 |
| 1352.0 | 302.474 |
| 1353.0 | 302.474 |
| 1354.0 | 302.474 |
| 1355.0 | 302.474 |
| 1356.0 | 302.474 |
| 1357.0 | 302.474 |
| 1358.0 | 302.474 |
| 1359.0 | 302.474 |
| 1360.0 | 302.474 |
| 1361.0 | 302.474 |
| 1362.0 | 302.474 |
| 1363.0 | 302.474 |
| 1364.0 | 302.474 |
| 1365.0 | 302.474 |
| 1366.0 | 302.474 |
| 1367.0 | 302.474 |
| 1368.0 | 302.474 |
| 1369.0 | 302.474 |
| 1370.0 | 302.474 |
| 1371.0 | 302.474 |
| 1372.0 | 302.474 |
| 1373.0 | 302.474 |
| 1374.0 | 302.474 |
| 1375.0 | 302.474 |
| 1376.0 | 302.474 |
| 1377.0 | 302.474 |
| 1378.0 | 302.474 |
| 1379.0 | 302.474 |
| 1380.0 | 302.474 |
| 1381.0 | 302.474 |
| 1382.0 | 302.474 |
| 1383.0 | 302.474 |
| 1384.0 | 302.474 |
| 1385.0 | 302.474 |
| 1386.0 | 302.474 |
| 1387.0 | 302.474 |
| 1388.0 | 302.474 |
| 1389.0 | 302.474 |
| 1390.0 | 302.474 |
| 1391.0 | 302.474 |
| 1392.0 | 302.474 |
| 1393.0 | 302.474 |
| 1394.0 | 302.474 |
| 1395.0 | 302.474 |
| 1396.0 | 302.474 |
| 1397.0 | 302.474 |
| 1398.0 | 302.474 |
| 1399.0 | 302.474 |
| 1400.0 | 302.474 |
| 1401.0 | 302.474 |
| 1402.0 | 302.474 |
| 1403.0 | 302.474 |
| 1404.0 | 302.474 |
| 1405.0 | 302.474 |
| 1406.0 | 302.474 |
| 1407.0 | 302.474 |
| 1408.0 | 302.474 |
| 1409.0 | 302.474 |
| 1410.0 | 302.474 |
| 1411.0 | 302.474 |
| 1412.0 | 302.474 |
| 1413.0 | 302.474 |
| 1414.0 | 302.474 |
| 1415.0 | 302.474 |
| 1416.0 | 302.474 |
| 1417.0 | 302.474 |
| 1418.0 | 302.474 |
| 1419.0 | 302.474 |
| 1420.0 | 302.474 |
| 1421.0 | 302.474 |
| 1422.0 | 302.474 |
| 1423.0 | 302.474 |
| 1424.0 | 302.474 |
| 1425.0 | 302.474 |
| 1426.0 | 302.474 |
| 1427.0 | 302.474 |
| 1428.0 | 302.474 |
| 1429.0 | 302.474 |
| 1430.0 | 302.474 |
| 1431.0 | 302.474 |
| 1432.0 | 302.474 |
| 1433.0 | 302.474 |
| 1434.0 | 302.474 |
| 1435.0 | 302.474 |
| 1436.0 | 302.474 |
| 1437.0 | 302.474 |
| 1438.0 | 302.474 |
| 1439.0 | 302.474 |
| 1440.0 | 302.474 |
| 1441.0 | 302.474 |
| 1442.0 | 302.474 |
| 1443.0 | 302.474 |
| 1444.0 | 302.474 |
| 1445.0 | 302.474 |
| 1446.0 | 302.474 |
| 1447.0 | 302.474 |
| 1448.0 | 302.474 |
| 1449.0 | 302.474 |
| 1450.0 | 302.474 |
| 1451.0 | 302.474 |
| 1452.0 | 302.474 |
| 1453.0 | 302.474 |
| 1454.0 | 302.474 |
| 1455.0 | 302.474 |
| 1456.0 | 302.474 |
| 1457.0 | 302.474 |
| 1458.0 | 302.474 |
| 1459.0 | 302.474 |
| 1460.0 | 302.474 |
| 1461.0 | 302.474 |
| 1462.0 | 302.474 |
| 1463.0 | 302.474 |
| 1464.0 | 302.474 |
| 1465.0 | 302.474 |
| 1466.0 | 302.474 |
| 1467.0 | 302.474 |
| 1468.0 | 302.474 |
| 1469.0 | 302.474 |
| 1470.0 | 302.474 |
| 1471.0 | 302.474 |
| 1472.0 | 302.474 |
| 1473.0 | 302.474 |
| 1474.0 | 302.474 |
| 1475.0 | 302.474 |
| 1476.0 | 302.474 |
| 1477.0 | 302.474 |
| 1478.0 | 302.474 |
| 1479.0 | 302.474 |
| 1480.0 | 302.474 |
| 1481.0 | 302.474 |
| 1482.0 | 302.474 |
| 1483.0 | 302.474 |
| 1484.0 | 302.474 |
| 1485.0 | 302.474 |
| 1486.0 | 302.474 |
| 1487.0 | 302.474 |
| 1488.0 | 302.474 |
| 1489.0 | 302.474 |
| 1490.0 | 302.474 |
| 1491.0 | 302.474 |
| 1492.0 | 302.474 |
| 1493.0 | 302.474 |
| 1494.0 | 302.474 |
| 1495.0 | 302.474 |
| 1496.0 | 302.474 |
| 1497.0 | 302.474 |
| 1498.0 | 302.474 |
| 1499.0 | 302.474 |
| 1500.0 | 302.474 |
| 1501.0 | 302.474 |
| 1502.0 | 302.474 |
| 1503.0 | 302.474 |
| 1504.0 | 302.474 |
| 1505.0 | 302.474 |
| 1506.0 | 302.474 |
| 1507.0 | 302.474 |
| 1508.0 | 302.474 |
| 1509.0 | 302.474 |
| 1510.0 | 302.474 |
| 1511.0 | 302.474 |
| 1512.0 | 302.474 |
| 1513.0 | 302.474 |
| 1514.0 | 302.474 |
| 1515.0 | 302.474 |
| 1516.0 | 302.474 |
| 1517.0 | 302.474 |
| 1518.0 | 302.474 |
| 1519.0 | 302.474 |
| 1520.0 | 302.474 |
| 1521.0 | 302.474 |
| 1522.0 | 302.474 |
| 1523.0 | 302.474 |
| 1524.0 | 302.474 |
| 1525.0 | 302.474 |
| 1526.0 | 302.474 |
| 1527.0 | 302.474 |
| 1528.0 | 302.474 |
| 1529.0 | 302.474 |
| 1530.0 | 302.474 |
| 1531.0 | 302.474 |
| 1532.0 | 302.474 |
| 1533.0 | 302.474 |
| 1534.0 | 302.474 |
| 1535.0 | 302.474 |
| 1536.0 | 302.474 |
| 1537.0 | 302.474 |
| 1538.0 | 302.474 |
| 1539.0 | 302.474 |
| 1540.0 | 302.474 |
| 1541.0 | 302.474 |
| 1542.0 | 302.474 |
| 1543.0 | 302.474 |
| 1544.0 | 302.474 |
| 1545.0 | 302.474 |
| 1546.0 | 302.474 |
| 1547.0 | 302.474 |
| 1548.0 | 302.474 |
| 1549.0 | 302.474 |
| 1550.0 | 302.474 |
| 1551.0 | 302.474 |
| 1552.0 | 302.474 |
| 1553.0 | 302.474 |
| 1554.0 | 302.474 |
| 1555.0 | 302.474 |
| 1556.0 | 302.474 |
| 1557.0 | 302.474 |
| 1558.0 | 302.474 |
| 1559.0 | 302.474 |
| 1560.0 | 302.474 |
| 1561.0 | 302.474 |
| 1562.0 | 302.474 |
| 1563.0 | 302.474 |
| 1564.0 | 302.474 |
| 1565.0 | 302.474 |
| 1566.0 | 302.474 |
| 1567.0 | 302.474 |
| 1568.0 | 302.474 |
| 1569.0 | 302.474 |
| 1570.0 | 302.474 |
| 1571.0 | 302.474 |
| 1572.0 | 302.474 |
| 1573.0 | 302.474 |
| 1574.0 | 302.474 |
| 1575.0 | 302.474 |
| 1576.0 | 302.474 |
| 1577.0 | 302.474 |
| 1578.0 | 302.474 |
| 1579.0 | 302.474 |
| 1580.0 | 302.474 |
| 1581.0 | 302.474 |
| 1582.0 | 302.474 |
| 1583.0 | 302.474 |
| 1584.0 | 302.474 |
| 1585.0 | 302.474 |
| 1586.0 | 302.474 |
| 1587.0 | 302.474 |
| 1588.0 | 302.474 |
| 1589.0 | 302.474 |
| 1590.0 | 302.474 |
| 1591.0 | 302.474 |
| 1592.0 | 302.474 |
| 1593.0 | 302.474 |
| 1594.0 | 302.474 |
| 1595.0 | 302.474 |
| 1596.0 | 302.474 |
| 1597.0 | 302.474 |
| 1598.0 | 302.474 |
| 1599.0 | 302.474 |
| 1600.0 | 302.474 |
| 1601.0 | 302.474 |
| 1602.0 | 302.474 |
| 1603.0 | 302.474 |
| 1604.0 | 302.474 |
| 1605.0 | 302.474 |
| 1606.0 | 302.474 |
| 1607.0 | 302.474 |
| 1608.0 | 302.474 |
| 1609.0 | 302.474 |
| 1610.0 | 302.474 |
| 1611.0 | 302.474 |
| 1612.0 | 302.474 |
| 1613.0 | 302.474 |
| 1614.0 | 302.474 |
| 1615.0 | 302.474 |
| 1616.0 | 302.474 |
| 1617.0 | 302.474 |
| 1618.0 | 302.474 |
| 1619.0 | 302.474 |
| 1620.0 | 302.474 |
| 1621.0 | 302.474 |
| 1622.0 | 302.474 |
| 1623.0 | 302.474 |
| 1624.0 | 302.474 |
| 1625.0 | 302.474 |
| 1626.0 | 302.474 |
| 1627.0 | 302.474 |
| 1628.0 | 302.474 |
| 1629.0 | 302.474 |
| 1630.0 | 302.474 |
| 1631.0 | 302.474 |
| 1632.0 | 302.474 |
| 1633.0 | 302.474 |
| 1634.0 | 302.474 |
| 1635.0 | 302.474 |
| 1636.0 | 302.474 |
| 1637.0 | 302.474 |
| 1638.0 | 302.474 |
| 1639.0 | 302.474 |
| 1640.0 | 302.474 |
| 1641.0 | 302.474 |
| 1642.0 | 302.474 |
| 1643.0 | 302.474 |
| 1644.0 | 302.474 |
| 1645.0 | 302.474 |
| 1646.0 | 302.474 |
| 1647.0 | 302.474 |
| 1648.0 | 302.474 |
| 1649.0 | 302.474 |
| 1650.0 | 302.474 |
| 1651.0 | 302.474 |
| 1652.0 | 302.474 |
| 1653.0 | 302.474 |
| 1654.0 | 302.474 |
| 1655.0 | 302.474 |
| 1656.0 | 302.474 |
| 1657.0 | 302.474 |
| 1658.0 | 302.474 |
| 1659.0 | 302.474 |
| 1660.0 | 302.474 |
| 1661.0 | 302.474 |
| 1662.0 | 302.474 |
| 1663.0 | 302.474 |
| 1664.0 | 302.474 |
| 1665.0 | 302.474 |
| 1666.0 | 302.474 |
| 1667.0 | 302.474 |
| 1668.0 | 302.474 |
| 1669.0 | 302.474 |
| 1670.0 | 302.474 |
| 1671.0 | 302.474 |
| 1672.0 | 302.474 |
| 1673.0 | 302.474 |
| 1674.0 | 302.474 |
| 1675.0 | 302.474 |
| 1676.0 | 302.474 |
| 1677.0 | 302.474 |
| 1678.0 | 302.474 |
| 1679.0 | 302.474 |
| 1680.0 | 302.474 |
| 1681.0 | 302.474 |
| 1682.0 | 302.474 |
| 1683.0 | 302.474 |
| 1684.0 | 302.474 |
| 1685.0 | 302.474 |
| 1686.0 | 302.474 |
| 1687.0 | 302.474 |
| 1688.0 | 302.474 |
| 1689.0 | 302.474 |
| 1690.0 | 302.474 |
| 1691.0 | 302.474 |
| 1692.0 | 302.474 |
| 1693.0 | 302.474 |
| 1694.0 | 302.474 |
| 1695.0 | 302.474 |
| 1696.0 | 302.474 |
| 1697.0 | 302.474 |
| 1698.0 | 302.474 |
| 1699.0 | 302.474 |
| 1700.0 | 302.474 |
| 1701.0 | 302.473 |
| 1702.0 | 302.474 |
| 1703.0 | 302.461 |
| 1704.0 | 302.448 |
| 1705.0 | 302.429 |
| 1706.0 | 302.407 |
| 1707.0 | 302.382 |
| 1708.0 | 302.355 |
| 1709.0 | 302.326 |
| 1710.0 | 302.296 |
| 1711.0 | 302.264 |
| 1712.0 | 302.232 |
| 1713.0 | 302.199 |
| 1714.0 | 302.166 |
| 1715.0 | 302.133 |
| 1716.0 | 302.1 |
| 1717.0 | 302.067 |
| 1718.0 | 302.035 |
| 1719.0 | 302.003 |
| 1720.0 | 301.973 |
| 1721.0 | 301.944 |
| 1722.0 | 301.915 |
| 1723.0 | 301.889 |
| 1724.0 | 301.863 |
| 1725.0 | 301.84 |
| 1726.0 | 301.819 |
| 1727.0 | 301.8 |
| 1728.0 | 301.784 |
| 1729.0 | 301.771 |
| 1730.0 | 301.76 |
| 1731.0 | 301.752 |
| 1732.0 | 301.746 |
| 1733.0 | 301.742 |
| 1734.0 | 301.741 |
| 1735.0 | 301.741 |
| 1736.0 | 301.742 |
| 1737.0 | 301.746 |
| 1738.0 | 301.751 |
| 1739.0 | 301.757 |
| 1740.0 | 301.765 |
| 1741.0 | 301.775 |
| 1742.0 | 301.784 |
| 1743.0 | 301.808 |
| 1744.0 | 301.833 |
| 1745.0 | 301.863 |
| 1746.0 | 301.895 |
| 1747.0 | 301.928 |
| 1748.0 | 301.962 |
| 1749.0 | 301.996 |
| 1750.0 | 302.03 |
| 1751.0 | 302.063 |
| 1752.0 | 302.095 |
| 1753.0 | 302.126 |
| 1754.0 | 302.156 |
| 1755.0 | 302.184 |
| 1756.0 | 302.211 |
| 1757.0 | 302.236 |
| 1758.0 | 302.26 |
| 1759.0 | 302.282 |
| 1760.0 | 302.303 |
| 1761.0 | 302.323 |
| 1762.0 | 302.341 |
| 1763.0 | 302.358 |
| 1764.0 | 302.374 |
| 1765.0 | 302.388 |
| 1766.0 | 302.402 |
| 1767.0 | 302.415 |
| 1768.0 | 302.427 |
| 1769.0 | 302.438 |
| 1770.0 | 302.448 |
| 1771.0 | 302.457 |
| 1772.0 | 302.466 |
| 1773.0 | 302.474 |
| 1774.0 | 302.482 |
| 1775.0 | 302.489 |
| 1776.0 | 302.495 |
| 1777.0 | 302.501 |
| 1778.0 | 302.507 |
| 1779.0 | 302.512 |
| 1780.0 | 302.517 |
| 1781.0 | 302.521 |
| 1782.0 | 302.525 |
| 1783.0 | 302.529 |
| 1784.0 | 302.532 |
| 1785.0 | 302.535 |
| 1786.0 | 302.538 |
| 1787.0 | 302.541 |
| 1788.0 | 302.544 |
| 1789.0 | 302.546 |
| 1790.0 | 302.548 |
| 1791.0 | 302.55 |
| 1792.0 | 302.552 |
| 1793.0 | 302.554 |
| 1794.0 | 302.556 |
| 1795.0 | 302.557 |
| 1796.0 | 302.558 |
| 1797.0 | 302.56 |
| 1798.0 | 302.561 |
| 1799.0 | 302.562 |
| 1800.0 | 302.563 |
| 1801.0 | 302.564 |
| 1802.0 | 302.565 |
| 1803.0 | 302.565 |
| 1804.0 | 302.566 |
| 1805.0 | 302.567 |
| 1806.0 | 302.568 |
| 1807.0 | 302.568 |
| 1808.0 | 302.569 |
| 1809.0 | 302.569 |
| 1810.0 | 302.57 |
| 1811.0 | 302.57 |
| 1812.0 | 302.57 |
| 1813.0 | 302.571 |
| 1814.0 | 302.571 |
| 1815.0 | 302.571 |
| 1816.0 | 302.572 |
| 1817.0 | 302.572 |
| 1818.0 | 302.572 |
| 1819.0 | 302.572 |
| 1820.0 | 302.573 |
| 1821.0 | 302.573 |
| 1822.0 | 302.573 |
| 1823.0 | 302.573 |
| 1824.0 | 302.573 |
| 1825.0 | 302.574 |
| 1826.0 | 302.574 |
| 1827.0 | 302.574 |
| 1828.0 | 302.574 |
| 1829.0 | 302.574 |
| 1830.0 | 302.574 |
| 1831.0 | 302.574 |
| 1832.0 | 302.574 |
| 1833.0 | 302.574 |
| 1834.0 | 302.574 |
| 1835.0 | 302.575 |
| 1836.0 | 302.575 |
| 1837.0 | 302.575 |
| 1838.0 | 302.575 |
| 1839.0 | 302.575 |
| 1840.0 | 302.575 |
| 1841.0 | 302.575 |
| 1842.0 | 302.575 |
| 1843.0 | 302.575 |
| 1844.0 | 302.575 |
| 1845.0 | 302.575 |
| 1846.0 | 302.575 |
| 1847.0 | 302.575 |
| 1848.0 | 302.575 |
| 1849.0 | 302.575 |
| 1850.0 | 302.575 |
| 1851.0 | 302.575 |
| 1852.0 | 302.575 |
| 1853.0 | 302.575 |
| 1854.0 | 302.575 |
| 1855.0 | 302.575 |
| 1856.0 | 302.575 |
| 1857.0 | 302.575 |
| 1858.0 | 302.575 |
| 1859.0 | 302.575 |
| 1860.0 | 302.575 |
| 1861.0 | 302.575 |
| 1862.0 | 302.575 |
| 1863.0 | 302.575 |
| 1864.0 | 302.575 |
| 1865.0 | 302.575 |
| 1866.0 | 302.575 |
| 1867.0 | 302.575 |
| 1868.0 | 302.575 |
| 1869.0 | 302.575 |
| 1870.0 | 302.575 |
| 1871.0 | 302.575 |
| 1872.0 | 302.575 |
| 1873.0 | 302.575 |
| 1874.0 | 302.575 |
| 1875.0 | 302.575 |
| 1876.0 | 302.575 |
| 1877.0 | 302.575 |
| 1878.0 | 302.575 |
| 1879.0 | 302.575 |
| 1880.0 | 302.575 |
| 1881.0 | 302.575 |
| 1882.0 | 302.575 |
| 1883.0 | 302.575 |
| 1884.0 | 302.575 |
| 1885.0 | 302.575 |
| 1886.0 | 302.575 |
| 1887.0 | 302.575 |
| 1888.0 | 302.575 |
| 1889.0 | 302.575 |
| 1890.0 | 302.575 |
| 1891.0 | 302.575 |
| 1892.0 | 302.575 |
| 1893.0 | 302.575 |
| 1894.0 | 302.575 |
| 1895.0 | 302.575 |
| 1896.0 | 302.575 |
| 1897.0 | 302.575 |
| 1898.0 | 302.575 |
| 1899.0 | 302.575 |
| 1900.0 | 302.575 |
| 1901.0 | 302.575 |
| 1902.0 | 302.575 |
| 1903.0 | 302.575 |
| 1904.0 | 302.575 |
| 1905.0 | 302.575 |
| 1906.0 | 302.575 |
| 1907.0 | 302.575 |
| 1908.0 | 302.575 |
| 1909.0 | 302.575 |
| 1910.0 | 302.575 |
| 1911.0 | 302.575 |
| 1912.0 | 302.575 |
| 1913.0 | 302.575 |
| 1914.0 | 302.575 |
| 1915.0 | 302.575 |
| 1916.0 | 302.575 |
| 1917.0 | 302.575 |
| 1918.0 | 302.575 |
| 1919.0 | 302.575 |
| 1920.0 | 302.575 |
| 1921.0 | 302.575 |
| 1922.0 | 302.575 |
| 1923.0 | 302.575 |
| 1924.0 | 302.575 |
| 1925.0 | 302.575 |
| 1926.0 | 302.575 |
| 1927.0 | 302.575 |
| 1928.0 | 302.575 |
| 1929.0 | 302.575 |
| 1930.0 | 302.575 |
| 1931.0 | 302.575 |
| 1932.0 | 302.575 |
| 1933.0 | 302.575 |
| 1934.0 | 302.575 |
| 1935.0 | 302.575 |
| 1936.0 | 302.575 |
| 1937.0 | 302.575 |
| 1938.0 | 302.575 |
| 1939.0 | 302.575 |
| 1940.0 | 302.575 |
| 1941.0 | 302.575 |
| 1942.0 | 302.575 |
| 1943.0 | 302.575 |
| 1944.0 | 302.575 |
| 1945.0 | 302.575 |
| 1946.0 | 302.575 |
| 1947.0 | 302.575 |
| 1948.0 | 302.575 |
| 1949.0 | 302.575 |
| 1950.0 | 302.575 |
| 1951.0 | 302.575 |
| 1952.0 | 302.575 |
| 1953.0 | 302.575 |
| 1954.0 | 302.575 |
| 1955.0 | 302.575 |
| 1956.0 | 302.575 |
| 1957.0 | 302.575 |
| 1958.0 | 302.575 |
| 1959.0 | 302.575 |
| 1960.0 | 302.575 |
| 1961.0 | 302.575 |
| 1962.0 | 302.575 |
| 1963.0 | 302.575 |
| 1964.0 | 302.575 |
| 1965.0 | 302.575 |
| 1966.0 | 302.575 |
| 1967.0 | 302.575 |
| 1968.0 | 302.575 |
| 1969.0 | 302.575 |
| 1970.0 | 302.575 |
| 1971.0 | 302.575 |
| 1972.0 | 302.575 |
| 1973.0 | 302.575 |
| 1974.0 | 302.575 |
| 1975.0 | 302.575 |
| 1976.0 | 302.575 |
| 1977.0 | 302.575 |
| 1978.0 | 302.575 |
| 1979.0 | 302.575 |
| 1980.0 | 302.575 |
| 1981.0 | 302.575 |
| 1982.0 | 302.575 |
| 1983.0 | 302.575 |
| 1984.0 | 302.575 |
| 1985.0 | 302.575 |
| 1986.0 | 302.575 |
| 1987.0 | 302.575 |
| 1988.0 | 302.575 |
| 1989.0 | 302.575 |
| 1990.0 | 302.575 |
| 1991.0 | 302.575 |
| 1992.0 | 302.575 |
| 1993.0 | 302.575 |
| 1994.0 | 302.575 |
| 1995.0 | 302.575 |
| 1996.0 | 302.575 |
| 1997.0 | 302.575 |
| 1998.0 | 302.575 |
| 1999.0 | 302.575 |
| 2000.0 | 302.575 |
| 2001.0 | 302.575 |
| 2002.0 | 302.575 |
| 2003.0 | 302.575 |
| 2004.0 | 302.575 |
| 2005.0 | 302.575 |
| 2006.0 | 302.575 |
| 2007.0 | 302.575 |
| 2008.0 | 302.575 |
| 2009.0 | 302.575 |
| 2010.0 | 302.575 |
| 2011.0 | 302.575 |
| 2012.0 | 302.575 |
| 2013.0 | 302.575 |
| 2014.0 | 302.575 |
| 2015.0 | 302.575 |
| 2016.0 | 302.575 |
| 2017.0 | 302.575 |
| 2018.0 | 302.575 |
| 2019.0 | 302.575 |
| 2020.0 | 302.575 |
| 2021.0 | 302.575 |
| 2022.0 | 302.575 |
| 2023.0 | 302.575 |
| 2024.0 | 302.575 |
| 2025.0 | 302.575 |
| 2026.0 | 302.575 |
| 2027.0 | 302.575 |
| 2028.0 | 302.575 |
| 2029.0 | 302.575 |
| 2030.0 | 302.575 |
| 2031.0 | 302.575 |
| 2032.0 | 302.575 |
| 2033.0 | 302.575 |
| 2034.0 | 302.575 |
| 2035.0 | 302.575 |
| 2036.0 | 302.575 |
| 2037.0 | 302.575 |
| 2038.0 | 302.575 |
| 2039.0 | 302.575 |
| 2040.0 | 302.575 |
| 2041.0 | 302.575 |
| 2042.0 | 302.575 |
| 2043.0 | 302.575 |
| 2044.0 | 302.575 |
| 2045.0 | 302.575 |
| 2046.0 | 302.575 |
| 2047.0 | 302.575 |
| 2048.0 | 302.575 |
| 2049.0 | 302.575 |
| 2050.0 | 302.575 |
| 2051.0 | 302.575 |
| 2052.0 | 302.575 |
| 2053.0 | 302.575 |
| 2054.0 | 302.575 |
| 2055.0 | 302.575 |
| 2056.0 | 302.575 |
| 2057.0 | 302.575 |
| 2058.0 | 302.575 |
| 2059.0 | 302.575 |
| 2060.0 | 302.575 |
| 2061.0 | 302.575 |
| 2062.0 | 302.575 |
| 2063.0 | 302.575 |
| 2064.0 | 302.575 |
| 2065.0 | 302.575 |
| 2066.0 | 302.575 |
| 2067.0 | 302.575 |
| 2068.0 | 302.575 |
| 2069.0 | 302.575 |
| 2070.0 | 302.575 |
| 2071.0 | 302.575 |
| 2072.0 | 302.575 |
| 2073.0 | 302.575 |
| 2074.0 | 302.575 |
| 2075.0 | 302.575 |
| 2076.0 | 302.575 |
| 2077.0 | 302.575 |
| 2078.0 | 302.575 |
| 2079.0 | 302.575 |
| 2080.0 | 302.575 |
| 2081.0 | 302.575 |
| 2082.0 | 302.575 |
| 2083.0 | 302.575 |
| 2084.0 | 302.575 |
| 2085.0 | 302.575 |
| 2086.0 | 302.575 |
| 2087.0 | 302.575 |
| 2088.0 | 302.575 |
| 2089.0 | 302.575 |
| 2090.0 | 302.575 |
| 2091.0 | 302.575 |
| 2092.0 | 302.575 |
| 2093.0 | 302.575 |
| 2094.0 | 302.575 |
| 2095.0 | 302.575 |
| 2096.0 | 302.575 |
| 2097.0 | 302.575 |
| 2098.0 | 302.575 |
| 2099.0 | 302.575 |
| 2100.0 | 302.575 |
| 2101.0 | 302.575 |
| 2102.0 | 302.575 |
| 2103.0 | 302.575 |
| 2104.0 | 302.575 |
| 2105.0 | 302.575 |
| 2106.0 | 302.575 |
| 2107.0 | 302.575 |
| 2108.0 | 302.575 |
| 2109.0 | 302.575 |
| 2110.0 | 302.575 |
| 2111.0 | 302.575 |
| 2112.0 | 302.575 |
| 2113.0 | 302.575 |
| 2114.0 | 302.575 |
| 2115.0 | 302.575 |
| 2116.0 | 302.575 |
| 2117.0 | 302.575 |
| 2118.0 | 302.575 |
| 2119.0 | 302.575 |
| 2120.0 | 302.575 |
| 2121.0 | 302.575 |
| 2122.0 | 302.575 |
| 2123.0 | 302.575 |
| 2124.0 | 302.575 |
| 2125.0 | 302.575 |
| 2126.0 | 302.575 |
| 2127.0 | 302.575 |
| 2128.0 | 302.575 |
| 2129.0 | 302.575 |
| 2130.0 | 302.575 |
| 2131.0 | 302.575 |
| 2132.0 | 302.575 |
| 2133.0 | 302.575 |
| 2134.0 | 302.575 |
| 2135.0 | 302.575 |
| 2136.0 | 302.575 |
| 2137.0 | 302.575 |
| 2138.0 | 302.575 |
| 2139.0 | 302.575 |
| 2140.0 | 302.575 |
| 2141.0 | 302.575 |
| 2142.0 | 302.575 |
| 2143.0 | 302.575 |
| 2144.0 | 302.575 |
| 2145.0 | 302.575 |
| 2146.0 | 302.575 |
| 2147.0 | 302.575 |
| 2148.0 | 302.575 |
| 2149.0 | 302.575 |
| 2150.0 | 302.575 |
| 2151.0 | 302.575 |
| 2152.0 | 302.575 |
| 2153.0 | 302.575 |
| 2154.0 | 302.575 |
| 2155.0 | 302.575 |
| 2156.0 | 302.575 |
| 2157.0 | 302.575 |
| 2158.0 | 302.575 |
| 2159.0 | 302.575 |
| 2160.0 | 302.575 |
| 2161.0 | 302.575 |
| 2162.0 | 302.575 |
| 2163.0 | 302.575 |
| 2164.0 | 302.575 |
| 2165.0 | 302.575 |
| 2166.0 | 302.575 |
| 2167.0 | 302.575 |
| 2168.0 | 302.575 |
| 2169.0 | 302.575 |
| 2170.0 | 302.575 |
| 2171.0 | 302.575 |
| 2172.0 | 302.575 |
| 2173.0 | 302.575 |
| 2174.0 | 302.575 |
| 2175.0 | 302.575 |
| 2176.0 | 302.575 |
| 2177.0 | 302.575 |
| 2178.0 | 302.575 |
| 2179.0 | 302.575 |
| 2180.0 | 302.575 |
| 2181.0 | 302.575 |
| 2182.0 | 302.575 |
| 2183.0 | 302.575 |
| 2184.0 | 302.575 |
| 2185.0 | 302.575 |
| 2186.0 | 302.575 |
| 2187.0 | 302.575 |
| 2188.0 | 302.575 |
| 2189.0 | 302.575 |
| 2190.0 | 302.575 |
| 2191.0 | 302.575 |
| 2192.0 | 302.575 |
| 2193.0 | 302.575 |
| 2194.0 | 302.575 |
| 2195.0 | 302.575 |
| 2196.0 | 302.575 |
| 2197.0 | 302.575 |
| 2198.0 | 302.575 |
| 2199.0 | 302.575 |
| 2200.0 | 302.575 |
| 2201.0 | 302.575 |
| 2202.0 | 302.575 |
| 2203.0 | 302.575 |
| 2204.0 | 302.575 |
| 2205.0 | 302.575 |
| 2206.0 | 302.575 |
| 2207.0 | 302.575 |
| 2208.0 | 302.575 |
| 2209.0 | 302.575 |
| 2210.0 | 302.575 |
| 2211.0 | 302.575 |
| 2212.0 | 302.575 |
| 2213.0 | 302.575 |
| 2214.0 | 302.575 |
| 2215.0 | 302.575 |
| 2216.0 | 302.575 |
| 2217.0 | 302.575 |
| 2218.0 | 302.575 |
| 2219.0 | 302.575 |
| 2220.0 | 302.575 |
| 2221.0 | 302.575 |
| 2222.0 | 302.575 |
| 2223.0 | 302.575 |
| 2224.0 | 302.575 |
| 2225.0 | 302.575 |
| 2226.0 | 302.575 |
| 2227.0 | 302.575 |
| 2228.0 | 302.575 |
| 2229.0 | 302.575 |
| 2230.0 | 302.575 |
| 2231.0 | 302.575 |
| 2232.0 | 302.575 |
| 2233.0 | 302.575 |
| 2234.0 | 302.575 |
| 2235.0 | 302.575 |
| 2236.0 | 302.575 |
| 2237.0 | 302.575 |
| 2238.0 | 302.575 |
| 2239.0 | 302.575 |
| 2240.0 | 302.575 |
| 2241.0 | 302.575 |
| 2242.0 | 302.575 |
| 2243.0 | 302.575 |
| 2244.0 | 302.575 |
| 2245.0 | 302.575 |
| 2246.0 | 302.575 |
| 2247.0 | 302.575 |
| 2248.0 | 302.575 |
| 2249.0 | 302.575 |
| 2250.0 | 302.575 |
| 2251.0 | 302.575 |
| 2252.0 | 302.575 |
| 2253.0 | 302.575 |
| 2254.0 | 302.575 |
| 2255.0 | 302.575 |
| 2256.0 | 302.575 |
| 2257.0 | 302.575 |
| 2258.0 | 302.575 |
| 2259.0 | 302.575 |
| 2260.0 | 302.575 |
| 2261.0 | 302.575 |
| 2262.0 | 302.575 |
| 2263.0 | 302.575 |
| 2264.0 | 302.575 |
| 2265.0 | 302.575 |
| 2266.0 | 302.575 |
| 2267.0 | 302.575 |
| 2268.0 | 302.575 |
| 2269.0 | 302.575 |
| 2270.0 | 302.575 |
| 2271.0 | 302.575 |
| 2272.0 | 302.575 |
| 2273.0 | 302.575 |
| 2274.0 | 302.575 |
| 2275.0 | 302.575 |
| 2276.0 | 302.575 |
| 2277.0 | 302.575 |
| 2278.0 | 302.575 |
| 2279.0 | 302.575 |
| 2280.0 | 302.575 |
| 2281.0 | 302.575 |
| 2282.0 | 302.575 |
| 2283.0 | 302.575 |
| 2284.0 | 302.575 |
| 2285.0 | 302.575 |
| 2286.0 | 302.575 |
| 2287.0 | 302.575 |
| 2288.0 | 302.575 |
| 2289.0 | 302.575 |
| 2290.0 | 302.575 |
| 2291.0 | 302.575 |
| 2292.0 | 302.575 |
| 2293.0 | 302.575 |
| 2294.0 | 302.575 |
| 2295.0 | 302.575 |
| 2296.0 | 302.575 |
| 2297.0 | 302.575 |
| 2298.0 | 302.575 |
| 2299.0 | 302.575 |
| 2300.0 | 302.575 |
| 2301.0 | 302.575 |
| 2302.0 | 302.575 |
| 2303.0 | 302.575 |
| 2304.0 | 302.575 |
| 2305.0 | 302.575 |
| 2306.0 | 302.575 |
| 2307.0 | 302.575 |
| 2308.0 | 302.575 |
| 2309.0 | 302.575 |
| 2310.0 | 302.575 |
| 2311.0 | 302.575 |
| 2312.0 | 302.575 |
| 2313.0 | 302.575 |
| 2314.0 | 302.575 |
| 2315.0 | 302.575 |
| 2316.0 | 302.575 |
| 2317.0 | 302.575 |
| 2318.0 | 302.575 |
| 2319.0 | 302.575 |
| 2320.0 | 302.575 |
| 2321.0 | 302.575 |
| 2322.0 | 302.575 |
| 2323.0 | 302.575 |
| 2324.0 | 302.575 |
| 2325.0 | 302.575 |
| 2326.0 | 302.575 |
| 2327.0 | 302.575 |
| 2328.0 | 302.575 |
| 2329.0 | 302.575 |
| 2330.0 | 302.575 |
| 2331.0 | 302.575 |
| 2332.0 | 302.575 |
| 2333.0 | 302.575 |
| 2334.0 | 302.575 |
| 2335.0 | 302.575 |
| 2336.0 | 302.575 |
| 2337.0 | 302.575 |
| 2338.0 | 302.575 |
| 2339.0 | 302.575 |
| 2340.0 | 302.575 |
| 2341.0 | 302.575 |
| 2342.0 | 302.575 |
| 2343.0 | 302.575 |
| 2344.0 | 302.575 |
| 2345.0 | 302.575 |
| 2346.0 | 302.575 |
| 2347.0 | 302.575 |
| 2348.0 | 302.575 |
| 2349.0 | 302.575 |
| 2350.0 | 302.575 |
| 2351.0 | 302.575 |
| 2352.0 | 302.575 |
| 2353.0 | 302.575 |
| 2354.0 | 302.575 |
| 2355.0 | 302.575 |
| 2356.0 | 302.575 |
| 2357.0 | 302.575 |
| 2358.0 | 302.575 |
| 2359.0 | 302.575 |
| 2360.0 | 302.575 |
| 2361.0 | 302.575 |
| 2362.0 | 302.575 |
| 2363.0 | 302.575 |
| 2364.0 | 302.575 |
| 2365.0 | 302.575 |
| 2366.0 | 302.575 |
| 2367.0 | 302.575 |
| 2368.0 | 302.575 |
| 2369.0 | 302.575 |
| 2370.0 | 302.575 |
| 2371.0 | 302.575 |
| 2372.0 | 302.575 |
| 2373.0 | 302.575 |
| 2374.0 | 302.575 |
| 2375.0 | 302.575 |
| 2376.0 | 302.575 |
| 2377.0 | 302.575 |
| 2378.0 | 302.575 |
| 2379.0 | 302.575 |
| 2380.0 | 302.575 |
| 2381.0 | 302.575 |
| 2382.0 | 302.575 |
| 2383.0 | 302.575 |
| 2384.0 | 302.575 |
| 2385.0 | 302.575 |
| 2386.0 | 302.575 |
| 2387.0 | 302.575 |
| 2388.0 | 302.575 |
| 2389.0 | 302.575 |
| 2390.0 | 302.575 |
| 2391.0 | 302.575 |
| 2392.0 | 302.575 |
| 2393.0 | 302.575 |
| 2394.0 | 302.575 |
| 2395.0 | 302.575 |
| 2396.0 | 302.575 |
| 2397.0 | 302.575 |
| 2398.0 | 302.575 |
| 2399.0 | 302.575 |
| 2400.0 | 302.575 |
| 2401.0 | 302.575 |
| 2402.0 | 302.575 |
| 2403.0 | 302.575 |
| 2404.0 | 302.575 |
| 2405.0 | 302.575 |
| 2406.0 | 302.575 |
| 2407.0 | 302.575 |
| 2408.0 | 302.575 |
| 2409.0 | 302.575 |
| 2410.0 | 302.575 |
| 2411.0 | 302.575 |
| 2412.0 | 302.575 |
| 2413.0 | 302.575 |
| 2414.0 | 302.575 |
| 2415.0 | 302.575 |
| 2416.0 | 302.575 |
| 2417.0 | 302.575 |
| 2418.0 | 302.575 |
| 2419.0 | 302.575 |
| 2420.0 | 302.575 |
| 2421.0 | 302.575 |
| 2422.0 | 302.575 |
| 2423.0 | 302.575 |
| 2424.0 | 302.575 |
| 2425.0 | 302.575 |
| 2426.0 | 302.575 |
| 2427.0 | 302.575 |
| 2428.0 | 302.575 |
| 2429.0 | 302.575 |
| 2430.0 | 302.575 |
| 2431.0 | 302.575 |
| 2432.0 | 302.575 |
| 2433.0 | 302.575 |
| 2434.0 | 302.575 |
| 2435.0 | 302.575 |
| 2436.0 | 302.575 |
| 2437.0 | 302.575 |
| 2438.0 | 302.575 |
| 2439.0 | 302.575 |
| 2440.0 | 302.575 |
| 2441.0 | 302.575 |
| 2442.0 | 302.575 |
| 2443.0 | 302.575 |
| 2444.0 | 302.575 |
| 2445.0 | 302.575 |
| 2446.0 | 302.575 |
| 2447.0 | 302.575 |
| 2448.0 | 302.575 |
| 2449.0 | 302.575 |
| 2450.0 | 302.575 |
| 2451.0 | 302.575 |
| 2452.0 | 302.575 |
| 2453.0 | 302.575 |
| 2454.0 | 302.575 |
| 2455.0 | 302.575 |
| 2456.0 | 302.575 |
| 2457.0 | 302.575 |
| 2458.0 | 302.575 |
| 2459.0 | 302.575 |
| 2460.0 | 302.575 |
| 2461.0 | 302.575 |
| 2462.0 | 302.575 |
| 2463.0 | 302.575 |
| 2464.0 | 302.575 |
| 2465.0 | 302.575 |
| 2466.0 | 302.575 |
| 2467.0 | 302.575 |
| 2468.0 | 302.575 |
| 2469.0 | 302.575 |
| 2470.0 | 302.575 |
| 2471.0 | 302.575 |
| 2472.0 | 302.575 |
| 2473.0 | 302.575 |
| 2474.0 | 302.575 |
| 2475.0 | 302.575 |
| 2476.0 | 302.575 |
| 2477.0 | 302.575 |
| 2478.0 | 302.575 |
| 2479.0 | 302.575 |
| 2480.0 | 302.575 |
| 2481.0 | 302.575 |
| 2482.0 | 302.575 |
| 2483.0 | 302.575 |
| 2484.0 | 302.575 |
| 2485.0 | 302.575 |
| 2486.0 | 302.575 |
| 2487.0 | 302.575 |
| 2488.0 | 302.575 |
| 2489.0 | 302.575 |
| 2490.0 | 302.575 |
| 2491.0 | 302.575 |
| 2492.0 | 302.575 |
| 2493.0 | 302.575 |
| 2494.0 | 302.575 |
| 2495.0 | 302.575 |
| 2496.0 | 302.575 |
| 2497.0 | 302.575 |
| 2498.0 | 302.575 |
| 2499.0 | 302.575 |
| 2500.0 | 302.575 |